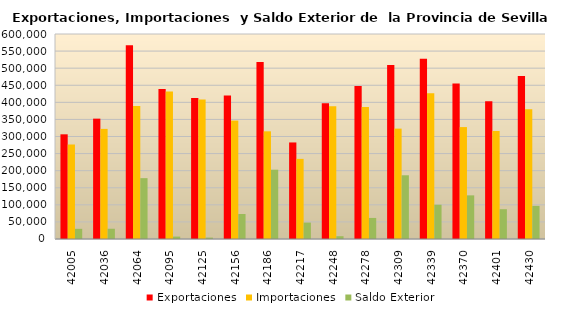
| Category | Exportaciones | Importaciones | Saldo Exterior |
|---|---|---|---|
| 2015-01-01 | 306377.926 | 276586.06 | 29791.865 |
| 2015-02-01 | 352248.138 | 322269.065 | 29979.072 |
| 2015-03-01 | 567244.111 | 389148.019 | 178096.092 |
| 2015-04-01 | 438884.342 | 431802.266 | 7082.076 |
| 2015-05-01 | 412569.733 | 408462.755 | 4106.978 |
| 2015-06-01 | 419661.321 | 346515.431 | 73145.89 |
| 2015-07-01 | 517960.526 | 315145.506 | 202815.02 |
| 2015-08-01 | 282564.812 | 234526.718 | 48038.094 |
| 2015-09-01 | 397062.334 | 388873.94 | 8188.394 |
| 2015-10-01 | 447933.163 | 386274.348 | 61658.815 |
| 2015-11-01 | 509556.466 | 323044.114 | 186512.352 |
| 2015-12-01 | 527244.501 | 426856.787 | 100387.714 |
| 2016-01-01 | 455250.121 | 327547.437 | 127702.684 |
| 2016-02-01 | 403337.352 | 316171.257 | 87166.094 |
| 2016-03-01 | 476800.378 | 379821.116 | 96979.263 |